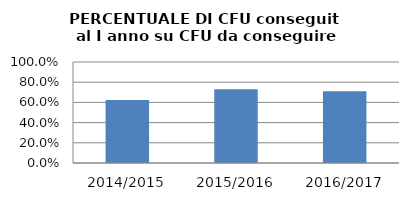
| Category | 2014/2015 2015/2016 2016/2017 |
|---|---|
| 2014/2015 | 0.623 |
| 2015/2016 | 0.731 |
| 2016/2017 | 0.71 |